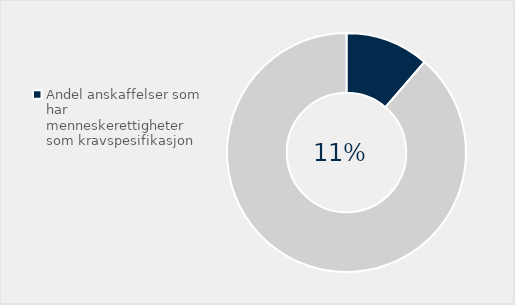
| Category | Series 0 |
|---|---|
| Andel anskaffelser som har menneskerettigheter som kravspesifikasjon | 0.113 |
| Ikke stilt krav | 0.887 |